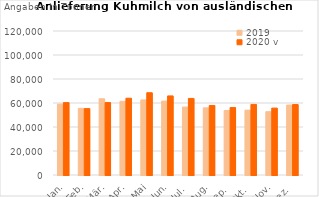
| Category | 2019 | 2020 v |
|---|---|---|
| Jan. | 59045.324 | 60317.722 |
| Feb. | 55555.762 | 55333.382 |
| Mär. | 63532.15 | 60374.08 |
| Apr. | 61409.862 | 63982.659 |
| Mai | 62550.889 | 68544.714 |
| Jun. | 61577.981 | 65895.525 |
| Jul. | 56583.089 | 63808.679 |
| Aug. | 55962.779 | 57952.918 |
| Sep. | 53799.414 | 56197.989 |
| Okt. | 54047.619 | 58812.909 |
| Nov. | 52749.917 | 55757.641 |
| Dez. | 58308.463 | 58721.58 |